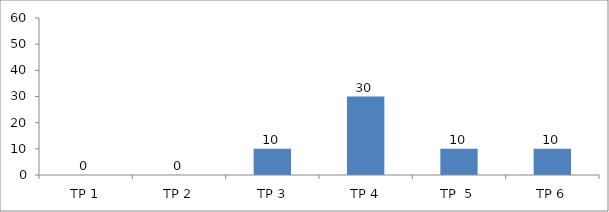
| Category | BIL. MURID |
|---|---|
| TP 1 | 0 |
| TP 2 | 0 |
|  TP 3 | 10 |
| TP 4 | 30 |
| TP  5 | 10 |
| TP 6 | 10 |